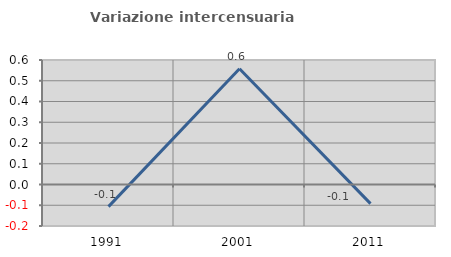
| Category | Variazione intercensuaria annua |
|---|---|
| 1991.0 | -0.107 |
| 2001.0 | 0.558 |
| 2011.0 | -0.092 |